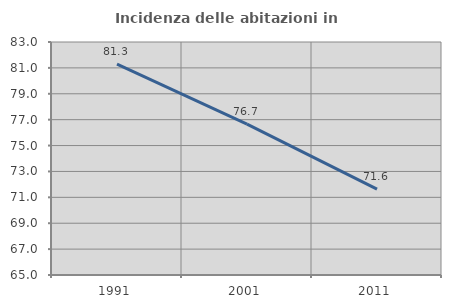
| Category | Incidenza delle abitazioni in proprietà  |
|---|---|
| 1991.0 | 81.282 |
| 2001.0 | 76.654 |
| 2011.0 | 71.637 |